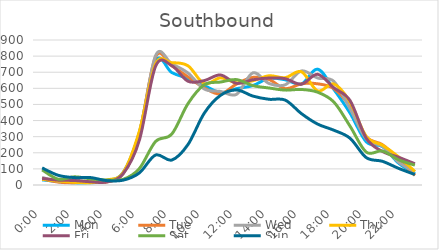
| Category | Mon | Tue | Wed | Thu | Fri | Sat | Sun |
|---|---|---|---|---|---|---|---|
| 0.0 | 32 | 38 | 47 | 36 | 41 | 94 | 106 |
| 0.041667 | 21 | 18 | 24 | 25 | 30 | 36 | 60 |
| 0.083333 | 12 | 13 | 32 | 17 | 28 | 51 | 46 |
| 0.125 | 13 | 22 | 17 | 13 | 20 | 38 | 46 |
| 0.166667 | 27 | 19 | 25 | 31 | 19 | 31 | 27 |
| 0.208333 | 78 | 73 | 70 | 77 | 70 | 35 | 30 |
| 0.25 | 326 | 322 | 299 | 334 | 278 | 102 | 75 |
| 0.291667 | 771 | 795 | 803 | 751 | 737 | 270 | 186 |
| 0.333333 | 698 | 740 | 752 | 759 | 741 | 316 | 155 |
| 0.375 | 661 | 671 | 695 | 740 | 644 | 505 | 251 |
| 0.416667 | 618 | 603 | 596 | 629 | 648 | 622 | 445 |
| 0.458333 | 574 | 565 | 581 | 665 | 683 | 639 | 556 |
| 0.5 | 598 | 627 | 563 | 634 | 631 | 654 | 590 |
| 0.541667 | 617 | 668 | 696 | 647 | 653 | 617 | 552 |
| 0.5833333333333334 | 662 | 655 | 630 | 678 | 664 | 602 | 532 |
| 0.625 | 653 | 598 | 622 | 666 | 660 | 589 | 527 |
| 0.666667 | 627 | 628 | 708 | 703 | 626 | 593 | 443 |
| 0.708333 | 719 | 628 | 664 | 584 | 687 | 576 | 378 |
| 0.75 | 593 | 598 | 643 | 627 | 603 | 515 | 340 |
| 0.791667 | 446 | 487 | 473 | 515 | 524 | 365 | 290 |
| 0.833333 | 268 | 300 | 285 | 301 | 290 | 204 | 170 |
| 0.875 | 238 | 250 | 240 | 247 | 208 | 211 | 147 |
| 0.916667 | 135 | 161 | 141 | 174 | 172 | 156 | 103 |
| 0.958333 | 71 | 59 | 82 | 84 | 132 | 123 | 65 |